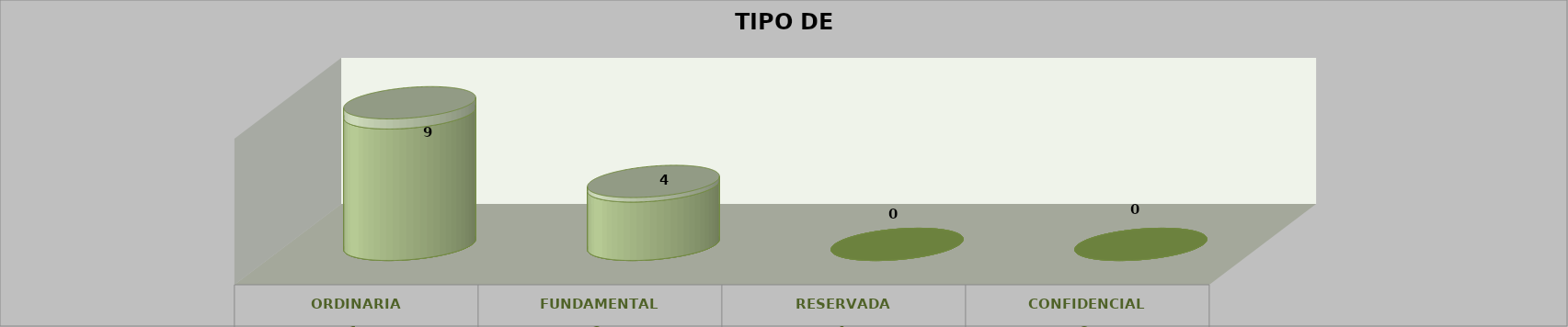
| Category | Series 0 | Series 2 | Series 1 | Series 3 | Series 4 |
|---|---|---|---|---|---|
| 0 |  |  |  | 9 | 0.692 |
| 1 |  |  |  | 4 | 0.308 |
| 2 |  |  |  | 0 | 0 |
| 3 |  |  |  | 0 | 0 |